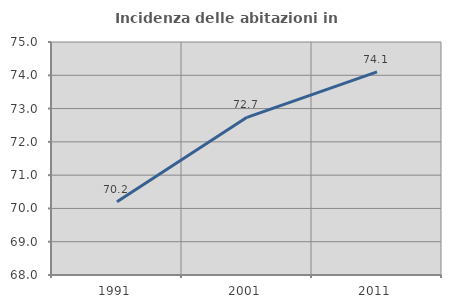
| Category | Incidenza delle abitazioni in proprietà  |
|---|---|
| 1991.0 | 70.198 |
| 2001.0 | 72.736 |
| 2011.0 | 74.104 |